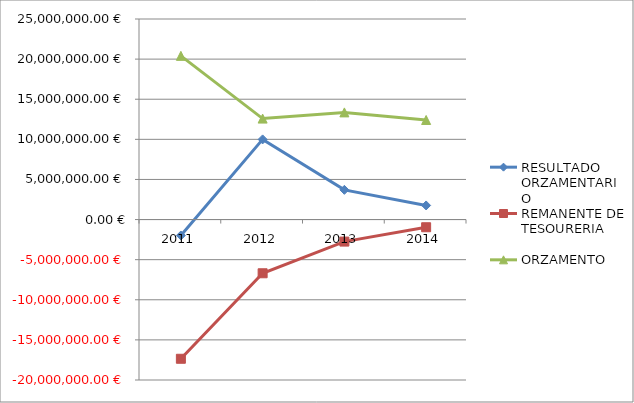
| Category | RESULTADO ORZAMENTARIO | REMANENTE DE TESOURERIA | ORZAMENTO |
|---|---|---|---|
| 2011.0 | -1985472.3 | -17354789.5 | 20403716.5 |
| 2012.0 | 9991978.06 | -6695294.36 | 12587050.16 |
| 2013.0 | 3702619.2 | -2745829.49 | 13356666.01 |
| 2014.0 | 1759790.67 | -958776.45 | 12412251.34 |